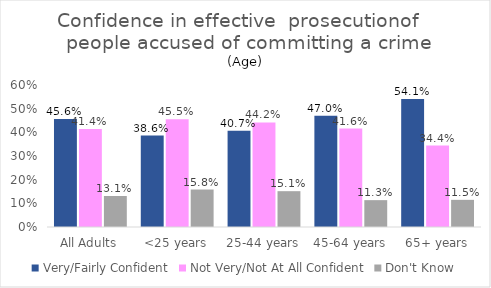
| Category | Very/Fairly Confident | Not Very/Not At All Confident | Don't Know |
|---|---|---|---|
| All Adults | 0.456 | 0.414 | 0.131 |
| <25 years | 0.386 | 0.455 | 0.158 |
| 25-44 years | 0.407 | 0.442 | 0.151 |
| 45-64 years | 0.47 | 0.416 | 0.113 |
| 65+ years | 0.541 | 0.344 | 0.115 |